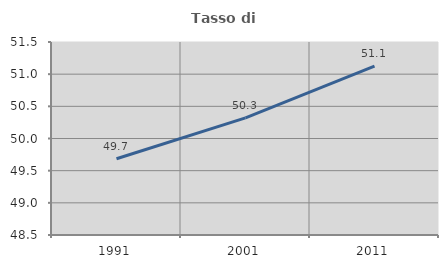
| Category | Tasso di occupazione   |
|---|---|
| 1991.0 | 49.686 |
| 2001.0 | 50.32 |
| 2011.0 | 51.124 |